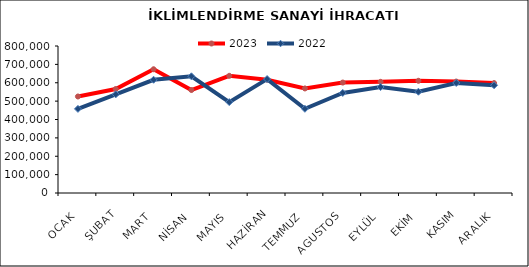
| Category | 2023 | 2022 |
|---|---|---|
| OCAK | 525223.397 | 457900.046 |
| ŞUBAT | 565894.768 | 536898.834 |
| MART | 673506.598 | 616156.921 |
| NİSAN | 560376.09 | 634958.222 |
| MAYIS | 637683.885 | 494690.451 |
| HAZİRAN | 616450.056 | 619959.083 |
| TEMMUZ | 569026.983 | 458391.492 |
| AGUSTOS | 601009.552 | 544484.219 |
| EYLÜL | 604999.348 | 576728.478 |
| EKİM | 610691.691 | 551112.195 |
| KASIM | 606459.895 | 598845.037 |
| ARALIK | 598211.815 | 586343.282 |